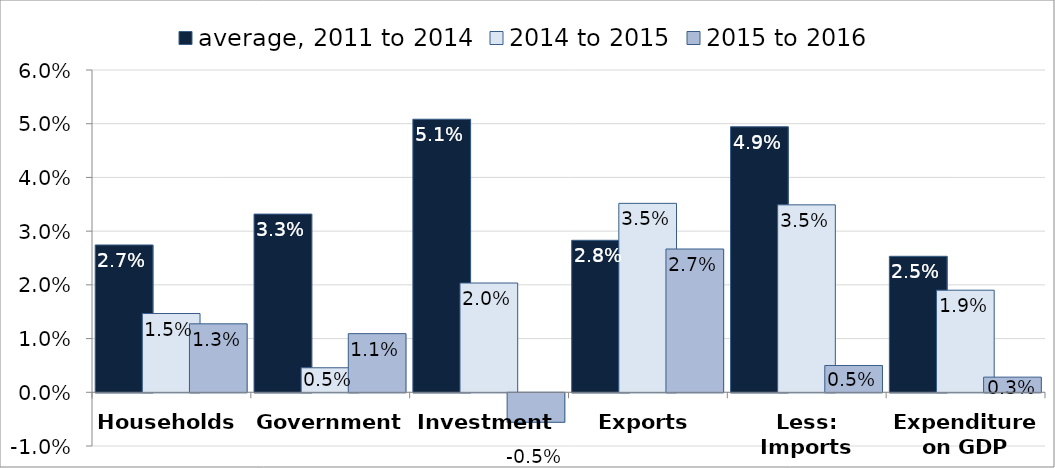
| Category | average, 2011 to 2014 | 2014 to 2015 | 2015 to 2016 |
|---|---|---|---|
| Households | 0.027 | 0.015 | 0.013 |
| Government | 0.033 | 0.005 | 0.011 |
| Investment | 0.051 | 0.02 | -0.005 |
| Exports | 0.028 | 0.035 | 0.027 |
| Less: Imports | 0.049 | 0.035 | 0.005 |
| Expenditure on GDP | 0.025 | 0.019 | 0.003 |